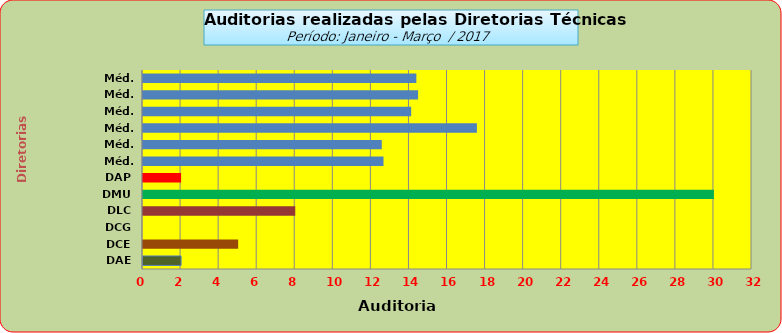
| Category | Series 0 |
|---|---|
| DAE | 2 |
| DCE | 5 |
| DCG | 0 |
| DLC | 8 |
| DMU | 30 |
| DAP | 2 |
| Méd. 2011 | 12.636 |
| Méd. 2012 | 12.545 |
| Méd. 2013 | 17.545 |
| Méd. 2014 | 14.091 |
| Méd. 2015 | 14.455 |
| Méd. 2016 | 14.364 |